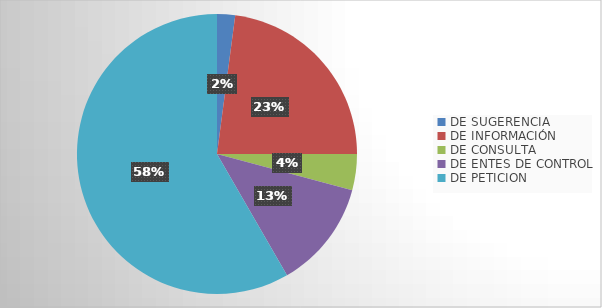
| Category | Series 0 |
|---|---|
| DE SUGERENCIA | 1 |
| DE INFORMACIÓN | 11 |
| DE CONSULTA | 2 |
| DE ENTES DE CONTROL | 6 |
| DE PETICION | 28 |